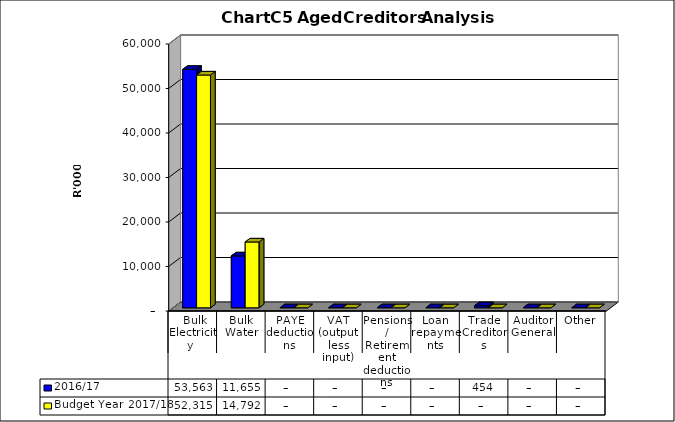
| Category | 2016/17 | Budget Year 2017/18 |
|---|---|---|
|  Bulk Electricity  | 53562924.87 | 52315048 |
| Bulk Water | 11654875.22 | 14791625 |
| PAYE deductions | 0 | 0 |
| VAT (output less input) | 0 | 0 |
| Pensions / Retirement deductions | 0 | 0 |
| Loan repayments | 0 | 0 |
| Trade Creditors | 453749.58 | 0 |
| Auditor General | 0 | 0 |
| Other | 0 | 0 |